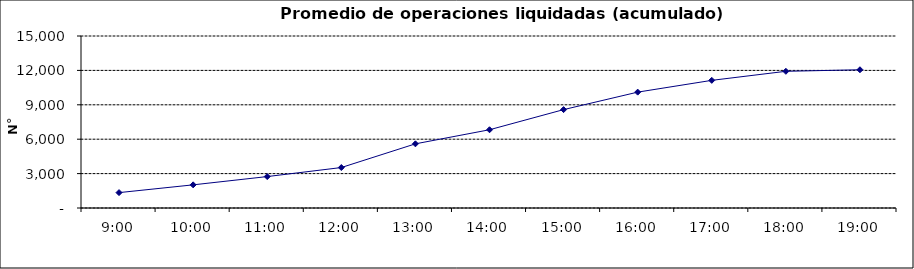
| Category | Promedio Op.Liquidadas (acumulado) |
|---|---|
| 0.375 | 1340.85 |
| 0.4166666666666667 | 2018.45 |
| 0.4583333333333333 | 2740.6 |
| 0.5 | 3528.35 |
| 0.5416666666666666 | 5595.9 |
| 0.5833333333333334 | 6824.05 |
| 0.625 | 8579.45 |
| 0.6666666666666666 | 10104.3 |
| 0.7083333333333334 | 11132.45 |
| 0.75 | 11921.35 |
| 0.7916666666666666 | 12055.85 |